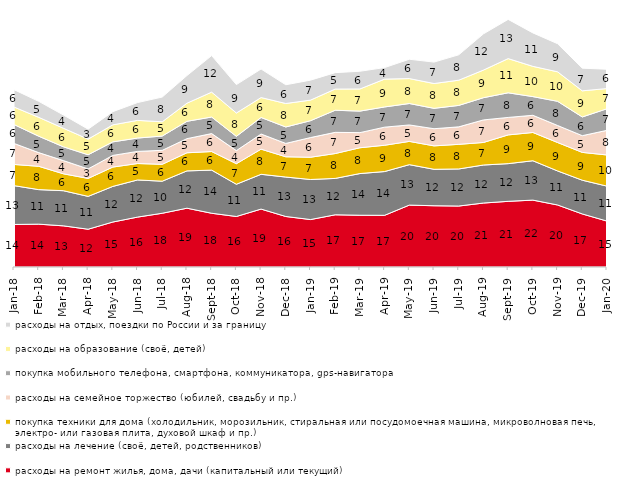
| Category | расходы на ремонт жилья, дома, дачи (капитальный или текущий) | расходы на лечение (своё, детей, родственников) | покупка техники для дома (холодильник, морозильник, стиральная или посудомоечная машина, микроволновая печь, электро- или газовая плита, духовой шкаф и пр.) | расходы на семейное торжество (юбилей, свадьбу и пр.) | покупка мобильного телефона, смартфона, коммуникатора, gps-навигатора | расходы на образование (своё, детей) | расходы на отдых, поездки по России и за границу |
|---|---|---|---|---|---|---|---|
| 2018-01-01 | 13.85 | 12.65 | 6.9 | 6.85 | 6.15 | 5.7 | 5.65 |
| 2018-02-01 | 13.95 | 11.25 | 7.6 | 4.45 | 5.35 | 6.15 | 5.2 |
| 2018-03-01 | 13.4 | 11.45 | 5.5 | 4.3 | 4.5 | 6.05 | 4.3 |
| 2018-04-01 | 12.3 | 10.7 | 5.85 | 3.1 | 4.6 | 5.1 | 3.25 |
| 2018-05-01 | 14.65 | 11.6 | 6.3 | 3.8 | 4.4 | 5.55 | 4.3 |
| 2018-06-01 | 16.25 | 12.1 | 5.35 | 3.95 | 4.35 | 5.75 | 5.8 |
| 2018-07-01 | 17.5 | 10.45 | 5.5 | 4.55 | 4.65 | 4.65 | 8.05 |
| 2018-08-01 | 19.15 | 12.15 | 5.9 | 4.6 | 5.65 | 5.9 | 9 |
| 2018-09-01 | 17.5 | 14.05 | 6.05 | 5.85 | 5.4 | 8.1 | 11.9 |
| 2018-10-01 | 16.45 | 10.5 | 6.7 | 4.25 | 4.65 | 7.6 | 9.25 |
| 2018-11-01 | 18.862 | 11.327 | 8.184 | 4.94 | 5.389 | 6.487 | 9.281 |
| 2018-12-01 | 16.45 | 12.85 | 6.6 | 4.35 | 5.35 | 7.65 | 6.1 |
| 2019-01-01 | 15.45 | 13.05 | 7.25 | 6.4 | 5.5 | 6.7 | 6.5 |
| 2019-02-01 | 17 | 11.85 | 8.1 | 6.9 | 7.2 | 6.9 | 5.35 |
| 2019-03-01 | 16.857 | 13.575 | 8.404 | 4.923 | 7.011 | 7.21 | 5.768 |
| 2019-04-01 | 16.832 | 14.257 | 8.564 | 5.891 | 6.584 | 9.059 | 3.762 |
| 2019-05-01 | 20.158 | 13.175 | 7.578 | 5.349 | 6.984 | 8.123 | 6.29 |
| 2019-06-01 | 19.95 | 11.87 | 7.631 | 5.586 | 6.633 | 8.08 | 6.983 |
| 2019-07-01 | 19.851 | 12.079 | 8.02 | 5.693 | 6.98 | 8.218 | 8.267 |
| 2019-08-01 | 20.829 | 12.388 | 7.343 | 7.343 | 7.243 | 8.991 | 11.788 |
| 2019-09-01 | 21.386 | 12.277 | 9.356 | 5.693 | 8.02 | 11.139 | 12.772 |
| 2019-10-01 | 21.782 | 12.822 | 9.208 | 5.594 | 6.089 | 9.851 | 10.891 |
| 2019-11-01 | 20.198 | 11.089 | 9.257 | 5.545 | 7.871 | 9.604 | 9.158 |
| 2019-12-01 | 17.277 | 10.99 | 9.059 | 5.446 | 6.089 | 8.515 | 7.376 |
| 2020-01-01 | 14.95 | 11.386 | 10.149 | 8.02 | 7.03 | 6.584 | 6.287 |